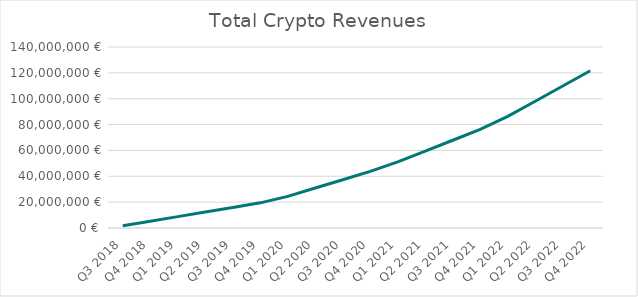
| Category | Total crypto revenues |
|---|---|
| Q3 2018 | 1757052 |
| Q4 2018 | 5271156 |
| Q1 2019 | 8804142.75 |
| Q2 2019 | 12356012.25 |
| Q3 2019 | 15907881.75 |
| Q4 2019 | 19459751.25 |
| Q1 2020 | 24455564.625 |
| Q2 2020 | 30895321.875 |
| Q3 2020 | 37335079.125 |
| Q4 2020 | 43774836.375 |
| Q1 2021 | 51171863.625 |
| Q2 2021 | 59526160.875 |
| Q3 2021 | 67880458.125 |
| Q4 2021 | 76234755.375 |
| Q1 2022 | 86297916 |
| Q2 2022 | 98069940 |
| Q3 2022 | 109841964 |
| Q4 2022 | 121613988 |